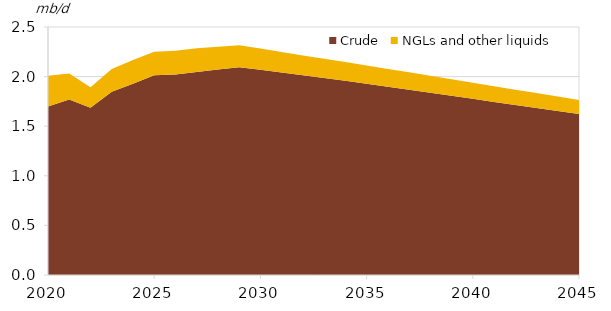
| Category | Crude | NGLs and other liquids |
|---|---|---|
| 2020-01-01 | 1.699 | 0.31 |
| 2021-01-01 | 1.77 | 0.261 |
| 2022-01-01 | 1.685 | 0.208 |
| 2023-01-01 | 1.848 | 0.228 |
| 2024-01-01 | 1.928 | 0.238 |
| 2025-01-01 | 2.013 | 0.238 |
| 2026-01-01 | 2.022 | 0.238 |
| 2027-01-01 | 2.047 | 0.238 |
| 2028-01-01 | 2.071 | 0.23 |
| 2029-01-01 | 2.094 | 0.222 |
| 2030-01-01 | 2.068 | 0.215 |
| 2031-01-01 | 2.041 | 0.207 |
| 2032-01-01 | 2.014 | 0.2 |
| 2033-01-01 | 1.986 | 0.194 |
| 2034-01-01 | 1.957 | 0.189 |
| 2035-01-01 | 1.928 | 0.184 |
| 2036-01-01 | 1.898 | 0.18 |
| 2037-01-01 | 1.868 | 0.175 |
| 2038-01-01 | 1.837 | 0.171 |
| 2039-01-01 | 1.807 | 0.166 |
| 2040-01-01 | 1.776 | 0.162 |
| 2041-01-01 | 1.745 | 0.158 |
| 2042-01-01 | 1.714 | 0.154 |
| 2043-01-01 | 1.683 | 0.15 |
| 2044-01-01 | 1.652 | 0.146 |
| 2045-01-01 | 1.622 | 0.143 |